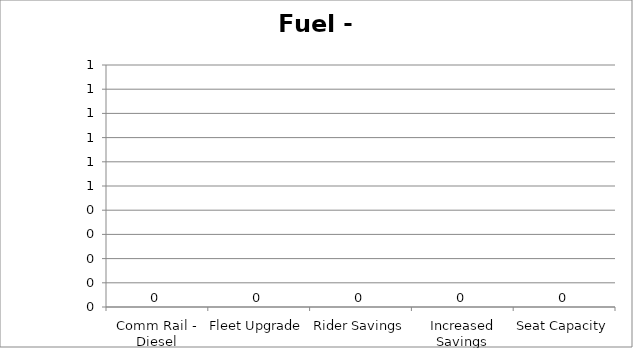
| Category | Fuel - GGE |
|---|---|
| Comm Rail - Diesel | 0 |
| Fleet Upgrade | 0 |
| Rider Savings | 0 |
| Increased Savings | 0 |
| Seat Capacity | 0 |